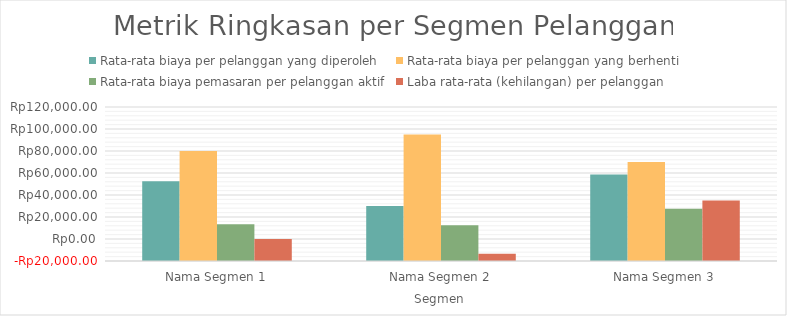
| Category | Rata-rata biaya per pelanggan yang diperoleh | Rata-rata biaya per pelanggan yang berhenti | Rata-rata biaya pemasaran per pelanggan aktif | Laba rata-rata (kehilangan) per pelanggan |
|---|---|---|---|---|
| Nama Segmen 1 | 52500 | 80000 | 13333.333 | 0 |
| Nama Segmen 2 | 30000 | 95000 | 12500 | -13500 |
| Nama Segmen 3 | 58750 | 70000 | 27500 | 35000 |